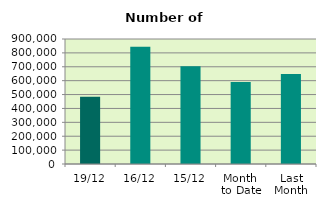
| Category | Series 0 |
|---|---|
| 19/12 | 484468 |
| 16/12 | 844052 |
| 15/12 | 703558 |
| Month 
to Date | 591128.615 |
| Last
Month | 647745.364 |